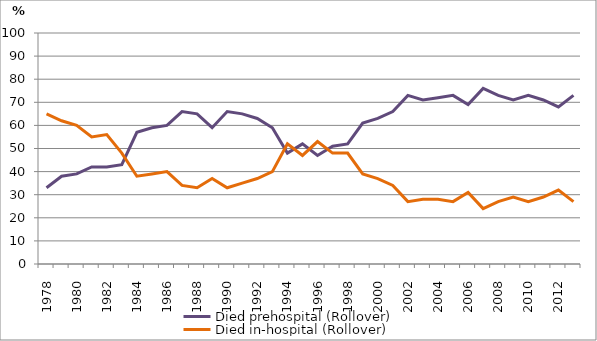
| Category | Died prehospital (Rollover) | Died in-hospital (Rollover) |
|---|---|---|
| 1978.0 | 33 | 65 |
| 1979.0 | 38 | 62 |
| 1980.0 | 39 | 60 |
| 1981.0 | 42 | 55 |
| 1982.0 | 42 | 56 |
| 1983.0 | 43 | 48 |
| 1984.0 | 57 | 38 |
| 1985.0 | 59 | 39 |
| 1986.0 | 60 | 40 |
| 1987.0 | 66 | 34 |
| 1988.0 | 65 | 33 |
| 1989.0 | 59 | 37 |
| 1990.0 | 66 | 33 |
| 1991.0 | 65 | 35 |
| 1992.0 | 63 | 37 |
| 1993.0 | 59 | 40 |
| 1994.0 | 48 | 52 |
| 1995.0 | 52 | 47 |
| 1996.0 | 47 | 53 |
| 1997.0 | 51 | 48 |
| 1998.0 | 52 | 48 |
| 1999.0 | 61 | 39 |
| 2000.0 | 63 | 37 |
| 2001.0 | 66 | 34 |
| 2002.0 | 73 | 27 |
| 2003.0 | 71 | 28 |
| 2004.0 | 72 | 28 |
| 2005.0 | 73 | 27 |
| 2006.0 | 69 | 31 |
| 2007.0 | 76 | 24 |
| 2008.0 | 73 | 27 |
| 2009.0 | 71 | 29 |
| 2010.0 | 73 | 27 |
| 2011.0 | 71 | 29 |
| 2012.0 | 68 | 32 |
| 2013.0 | 73 | 27 |